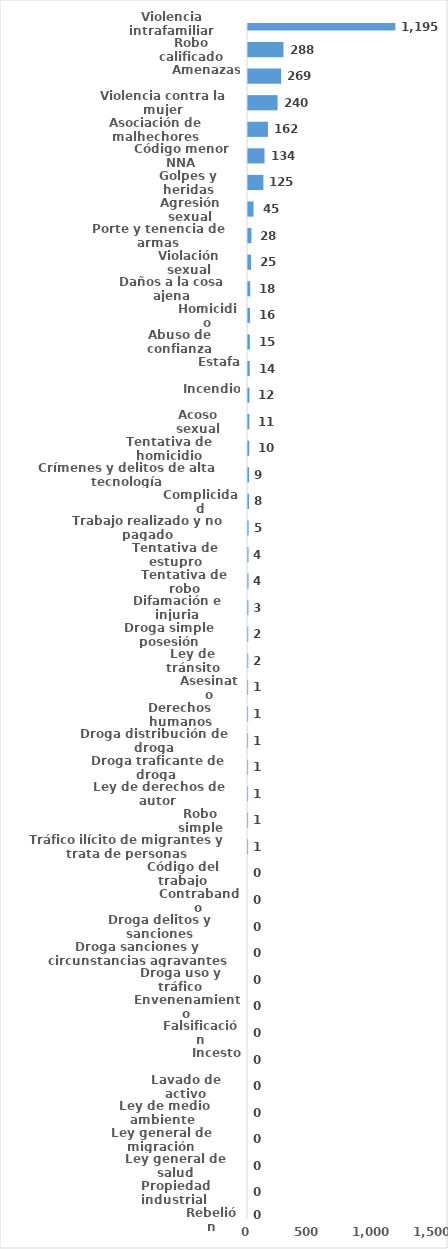
| Category | Series 0 |
|---|---|
| Violencia intrafamiliar | 1195 |
| Robo calificado | 288 |
| Amenazas | 269 |
| Violencia contra la mujer | 240 |
| Asociación de malhechores | 162 |
| Código menor NNA | 134 |
| Golpes y heridas | 125 |
| Agresión sexual | 45 |
| Porte y tenencia de armas | 28 |
| Violación sexual | 25 |
| Daños a la cosa ajena | 18 |
| Homicidio | 16 |
| Abuso de confianza | 15 |
| Estafa | 14 |
| Incendio | 12 |
| Acoso sexual | 11 |
| Tentativa de homicidio | 10 |
| Crímenes y delitos de alta tecnología | 9 |
| Complicidad | 8 |
| Trabajo realizado y no pagado | 5 |
| Tentativa de estupro | 4 |
| Tentativa de robo | 4 |
| Difamación e injuria | 3 |
| Droga simple posesión | 2 |
| Ley de tránsito | 2 |
| Asesinato | 1 |
| Derechos humanos | 1 |
| Droga distribución de droga | 1 |
| Droga traficante de droga  | 1 |
| Ley de derechos de autor  | 1 |
| Robo simple | 1 |
| Tráfico ilícito de migrantes y trata de personas | 1 |
| Código del trabajo | 0 |
| Contrabando | 0 |
| Droga delitos y sanciones | 0 |
| Droga sanciones y circunstancias agravantes | 0 |
| Droga uso y tráfico | 0 |
| Envenenamiento | 0 |
| Falsificación | 0 |
| Incesto | 0 |
| Lavado de activo | 0 |
| Ley de medio ambiente  | 0 |
| Ley general de migración | 0 |
| Ley general de salud | 0 |
| Propiedad industrial  | 0 |
| Rebelión | 0 |